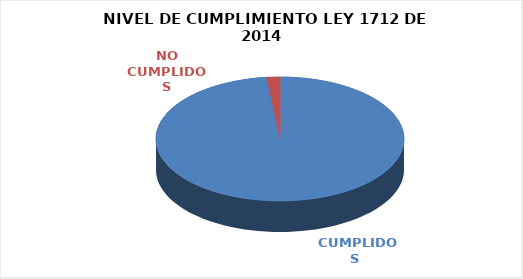
| Category | Series 0 |
|---|---|
|  CUMPLIDOS | 113 |
| NO CUMPLIDOS | 2 |